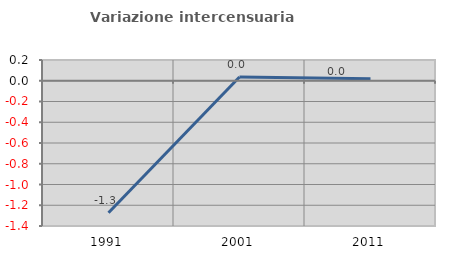
| Category | Variazione intercensuaria annua |
|---|---|
| 1991.0 | -1.272 |
| 2001.0 | 0.036 |
| 2011.0 | 0.018 |